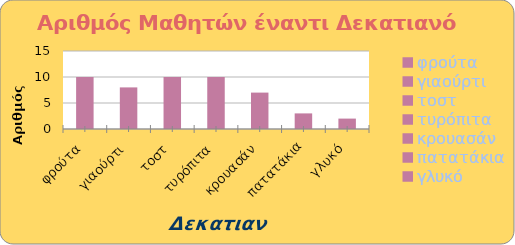
| Category | Αριθμός Μαθητών |
|---|---|
| φρούτα | 10 |
| γιαούρτι | 8 |
| τοστ | 10 |
| τυρόπιτα | 10 |
| κρουασάν | 7 |
| πατατάκια | 3 |
| γλυκό | 2 |